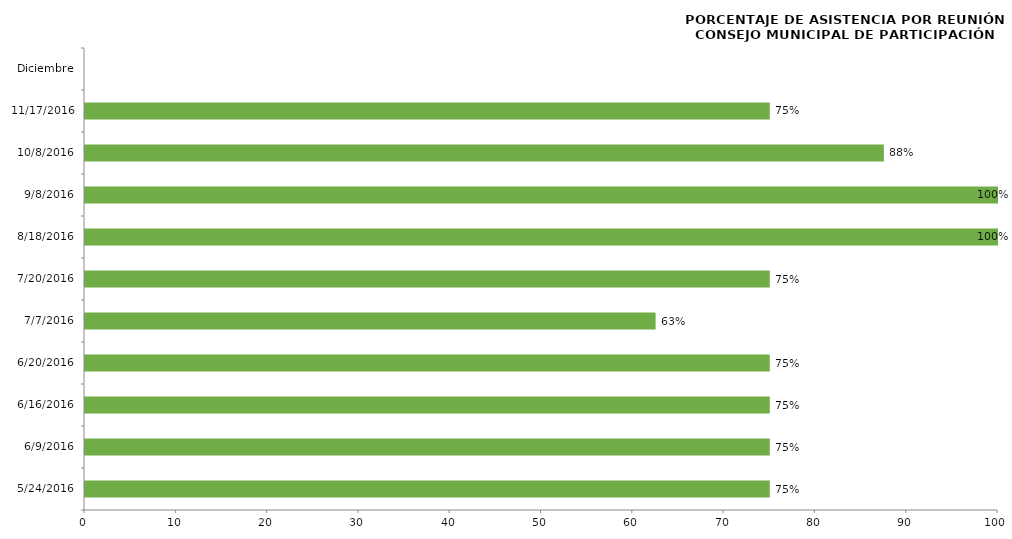
| Category | Series 0 |
|---|---|
| 24/05/2016 | 75 |
| 09/06/2016 | 75 |
| 16/06/2016 | 75 |
| 20/06/2016 | 75 |
| 07/07/2016 | 62.5 |
| 20/07/2016 | 75 |
| 18/08/2016 | 100 |
| 08/09/2016 | 100 |
| 08/10/2016 | 87.5 |
| 17/11/2016 | 75 |
| Diciembre | 0 |